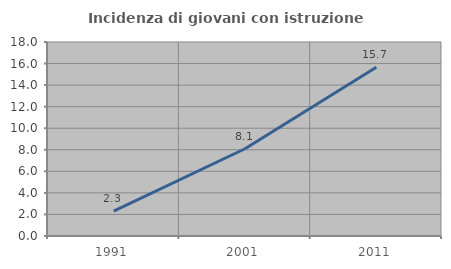
| Category | Incidenza di giovani con istruzione universitaria |
|---|---|
| 1991.0 | 2.308 |
| 2001.0 | 8.097 |
| 2011.0 | 15.663 |